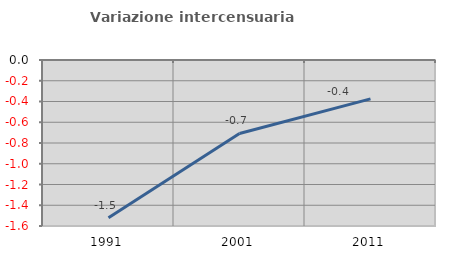
| Category | Variazione intercensuaria annua |
|---|---|
| 1991.0 | -1.52 |
| 2001.0 | -0.708 |
| 2011.0 | -0.374 |